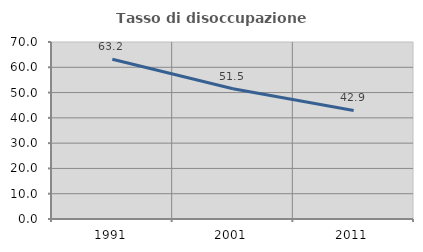
| Category | Tasso di disoccupazione giovanile  |
|---|---|
| 1991.0 | 63.158 |
| 2001.0 | 51.502 |
| 2011.0 | 42.925 |